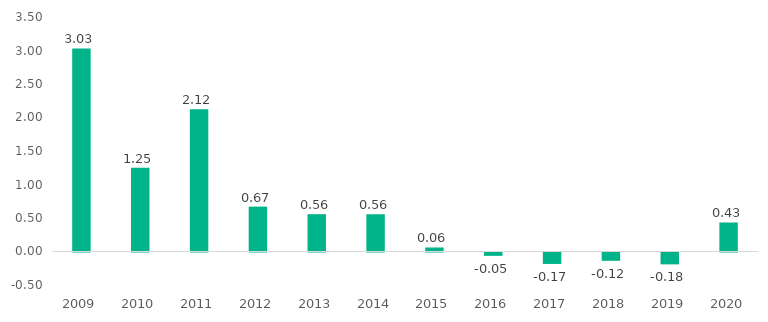
| Category | Series 1 |
|---|---|
| 2009.0 | 3.03 |
| 2010.0 | 1.25 |
| 2011.0 | 2.122 |
| 2012.0 | 0.67 |
| 2013.0 | 0.557 |
| 2014.0 | 0.556 |
| 2015.0 | 0.06 |
| 2016.0 | -0.05 |
| 2017.0 | -0.171 |
| 2018.0 | -0.124 |
| 2019.0 | -0.177 |
| 2020.0 | 0.433 |